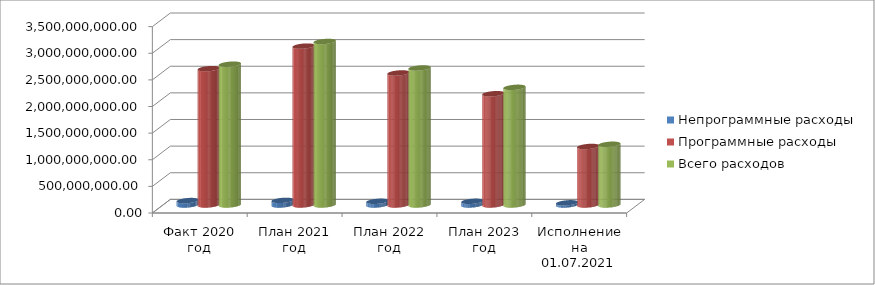
| Category | Непрограммные расходы | Программные расходы | Всего расходов |
|---|---|---|---|
| Факт 2020 год | 83148306 | 2561058133.41 | 2644206439.41 |
| План 2021 год | 87091660.26 | 2984152109.98 | 3071243770.24 |
| План 2022 год | 69635920 | 2479859366.6 | 2573855286.6 |
| План 2023 год | 69331020 | 2089976785.64 | 2209927805.64 |
| Исполнение на 01.07.2021 года | 41063018.03 | 1099355309.4 | 1140418327.43 |